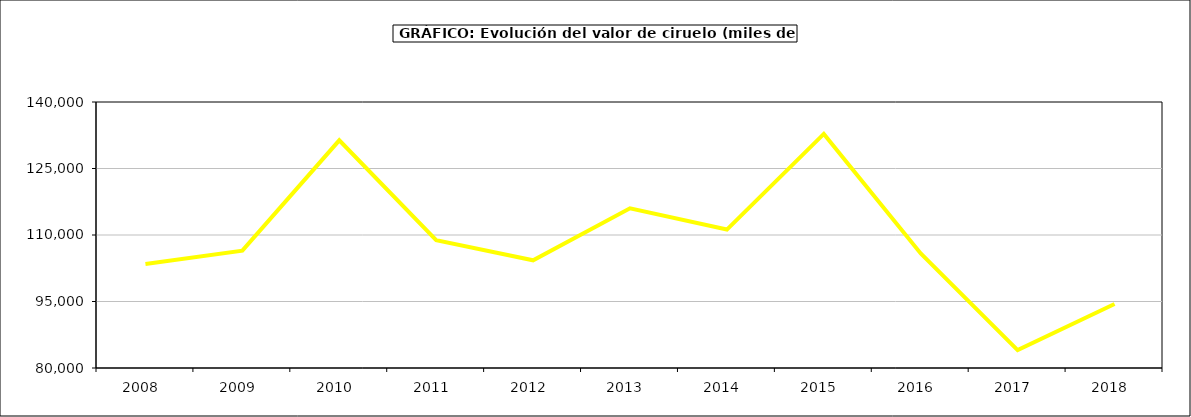
| Category | valor Ciruelo |
|---|---|
| 2008.0 | 103472.855 |
| 2009.0 | 106473.572 |
| 2010.0 | 131357.754 |
| 2011.0 | 108812.33 |
| 2012.0 | 104288.297 |
| 2013.0 | 116027.366 |
| 2014.0 | 111223.369 |
| 2015.0 | 132808 |
| 2016.0 | 105821 |
| 2017.0 | 84025.67 |
| 2018.0 | 94421.725 |